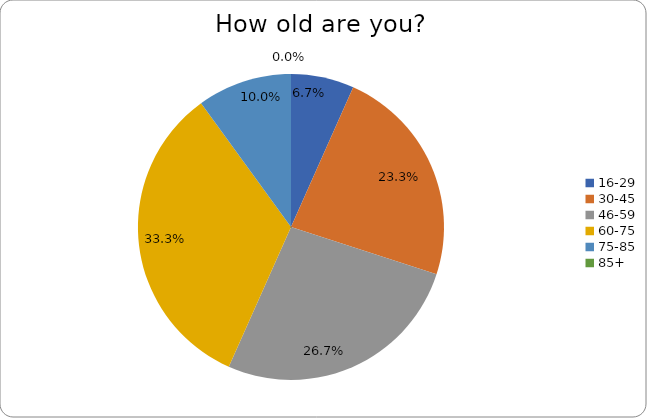
| Category | Series 0 |
|---|---|
| 16-29 | 0.067 |
| 30-45 | 0.233 |
| 46-59 | 0.267 |
| 60-75 | 0.333 |
| 75-85 | 0.1 |
| 85+ | 0 |